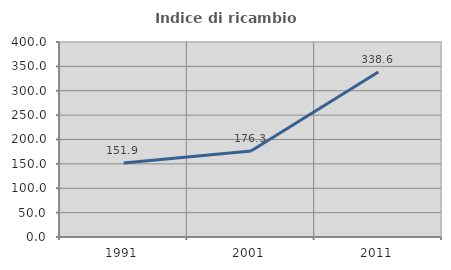
| Category | Indice di ricambio occupazionale  |
|---|---|
| 1991.0 | 151.931 |
| 2001.0 | 176.279 |
| 2011.0 | 338.608 |